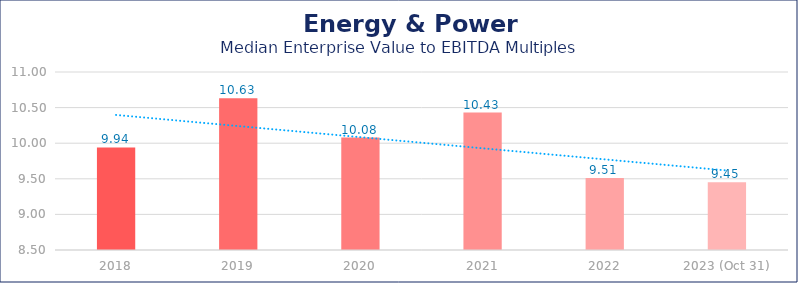
| Category | Energy & Power |
|---|---|
| 2018 | 9.94 |
| 2019 | 10.63 |
| 2020 | 10.08 |
| 2021 | 10.43 |
| 2022 | 9.51 |
| 2023 (Oct 31) | 9.45 |